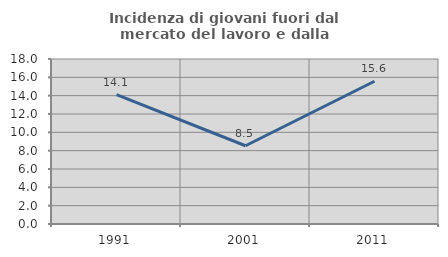
| Category | Incidenza di giovani fuori dal mercato del lavoro e dalla formazione  |
|---|---|
| 1991.0 | 14.113 |
| 2001.0 | 8.537 |
| 2011.0 | 15.574 |